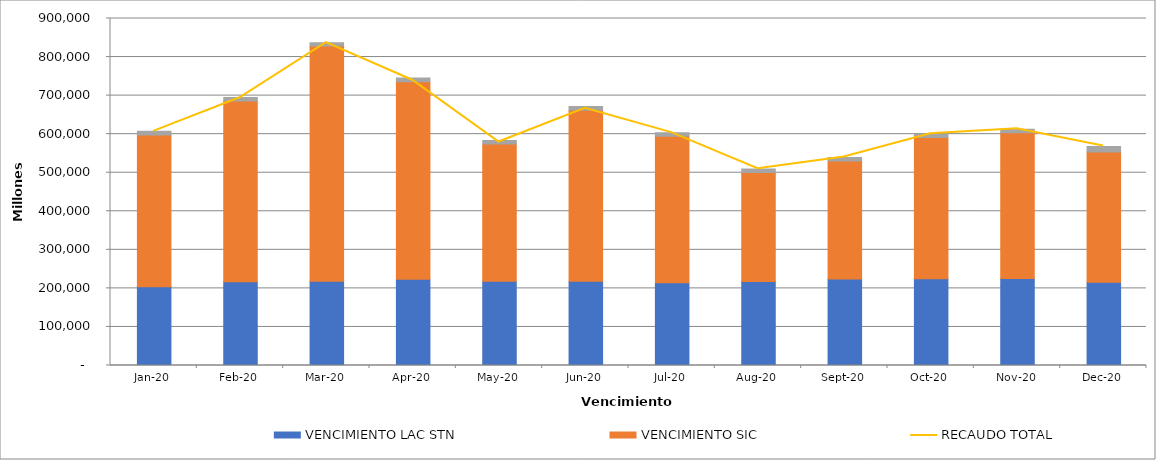
| Category | VENCIMIENTO LAC STN | VENCIMIENTO SIC | VENCIMIENTO LAC STR |
|---|---|---|---|
| 2020-01-17 | 204565.896 | 393573.836 | 9223.165 |
| 2020-02-17 | 217217.589 | 468724 | 9035.514 |
| 2020-03-17 | 218733.05 | 609765 | 8600.355 |
| 2020-04-17 | 223691.174 | 512469.323 | 9251.54 |
| 2020-05-17 | 218705.842 | 355997.15 | 8570.437 |
| 2020-06-17 | 218803.713 | 443304.475 | 9604.7 |
| 2020-07-17 | 214351.116 | 380435.707 | 8569.671 |
| 2020-08-17 | 217978.072 | 282441.407 | 9200.227 |
| 2020-09-17 | 224141.164 | 306101.508 | 9302.185 |
| 2020-10-17 | 224889.683 | 366167.855 | 8829.089 |
| 2020-11-17 | 225383.481 | 378045.019 | 9575.139 |
| 2020-12-17 | 215800.756 | 338235.004 | 13909.502 |